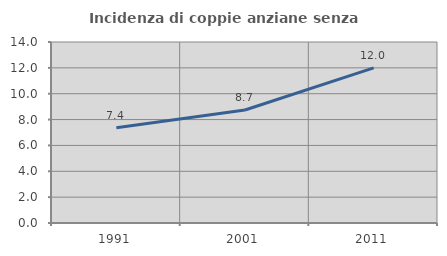
| Category | Incidenza di coppie anziane senza figli  |
|---|---|
| 1991.0 | 7.362 |
| 2001.0 | 8.743 |
| 2011.0 | 12 |